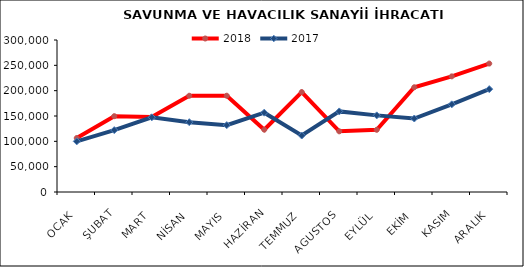
| Category | 2018 | 2017 |
|---|---|---|
| OCAK | 106506.348 | 99964.754 |
| ŞUBAT | 149655.075 | 122114.311 |
| MART | 147926.578 | 147396.471 |
| NİSAN | 189961.078 | 137727.171 |
| MAYIS | 190016.058 | 131955.448 |
| HAZİRAN | 123013.286 | 156546.928 |
| TEMMUZ | 197255.412 | 111487.755 |
| AGUSTOS | 119749.856 | 159009.366 |
| EYLÜL | 122785.728 | 151239.852 |
| EKİM | 206729.932 | 145058.477 |
| KASIM | 228238.168 | 173029.135 |
| ARALIK | 253496.138 | 202981.927 |